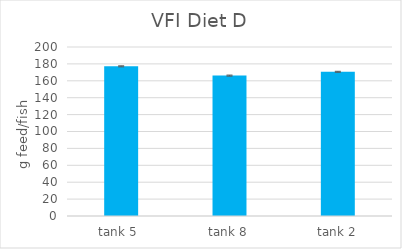
| Category | VFI |
|---|---|
| tank 5  | 177.119 |
| tank 8 | 166.149 |
| tank 2 | 170.67 |